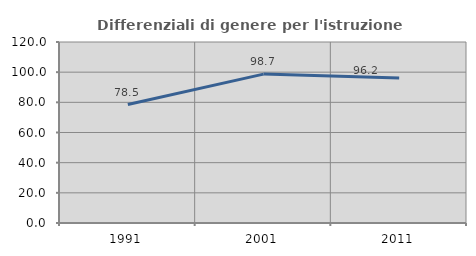
| Category | Differenziali di genere per l'istruzione superiore |
|---|---|
| 1991.0 | 78.535 |
| 2001.0 | 98.711 |
| 2011.0 | 96.204 |